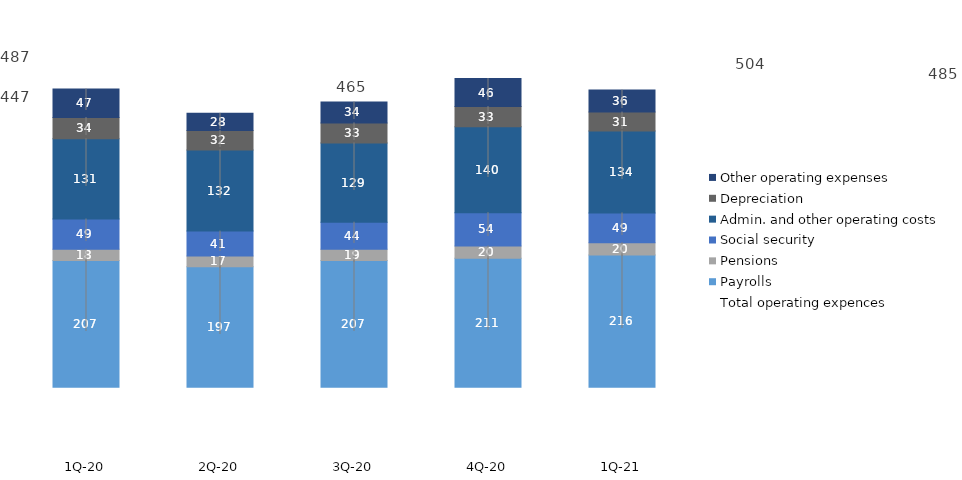
| Category | Payrolls | Pensions | Social security | Admin. and other operating costs | Depreciation | Other operating expenses |
|---|---|---|---|---|---|---|
| 1Q-21 | 215.824 | 19.858 | 48.709 | 133.755 | 30.808 | 35.9 |
| 4Q-20 | 210.623 | 19.854 | 54.351 | 140.351 | 32.718 | 45.632 |
| 3Q-20 | 206.727 | 18.585 | 43.952 | 129.288 | 32.697 | 34.057 |
| 2Q-20 | 196.66 | 17.386 | 40.656 | 132.408 | 31.771 | 27.996 |
| 1Q-20 | 206.729 | 18.337 | 49.424 | 130.978 | 34.5 | 46.562 |